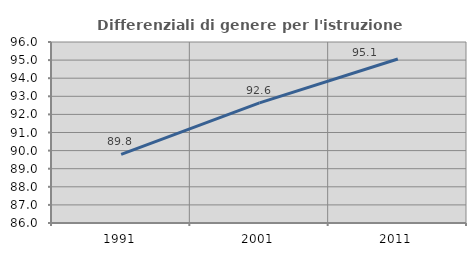
| Category | Differenziali di genere per l'istruzione superiore |
|---|---|
| 1991.0 | 89.792 |
| 2001.0 | 92.634 |
| 2011.0 | 95.06 |